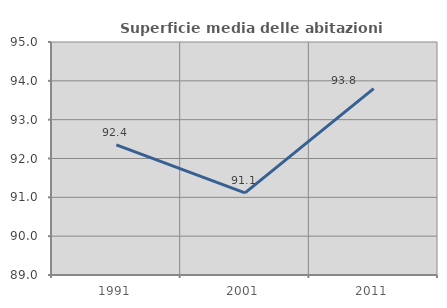
| Category | Superficie media delle abitazioni occupate |
|---|---|
| 1991.0 | 92.353 |
| 2001.0 | 91.115 |
| 2011.0 | 93.801 |